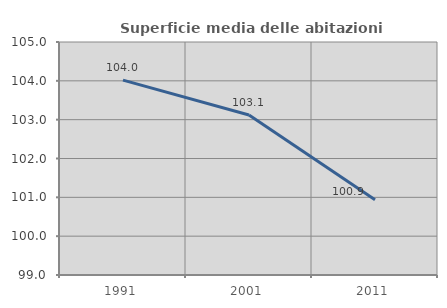
| Category | Superficie media delle abitazioni occupate |
|---|---|
| 1991.0 | 104.019 |
| 2001.0 | 103.119 |
| 2011.0 | 100.938 |